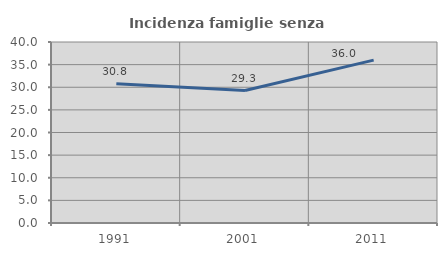
| Category | Incidenza famiglie senza nuclei |
|---|---|
| 1991.0 | 30.769 |
| 2001.0 | 29.268 |
| 2011.0 | 36 |